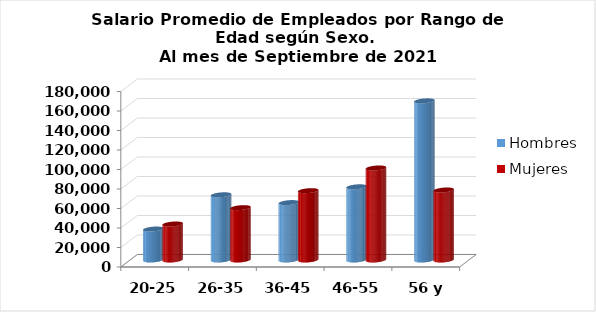
| Category | Hombres | Mujeres |
|---|---|---|
| 20-25 | 31758.5 | 36913.214 |
| 26-35 | 66884.938 | 53708.462 |
| 36-45 | 58890.841 | 71136.149 |
| 46-55 | 75092.983 | 94391.63 |
| 56 y más | 163261.852 | 71810.021 |